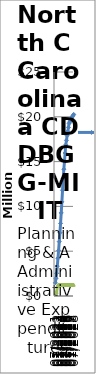
| Category | Projected Expenditures | Actual Expenditure |
|---|---|---|
| 07/2021 | 1469133.887 | 317236 |
| 10/2021 | 1967276.231 | 346652.92 |
| 01/2022 | 2525940.542 | 393251.51 |
| 04/2022 | 3331348.257 | 1084981.7 |
| 07/2022 | 4208625.807 | 1134493.33 |
| 10/2022 | 5085903.358 | 1265968.76 |
| 01/2023 | 6072876.974 | 1265968.76 |
| 04/2023 | 7064680.709 | 1265968.76 |
| 07/2023 | 8097336.771 | 1265968.76 |
| 10/2023 | 9272975.98 | 1265968.76 |
| 01/2024 | 10509893.681 | 1265968.76 |
| 04/2024 | 11808089.874 | 1265968.76 |
| 07/2024 | 13138060.099 | 1265968.76 |
| 10/2024 | 14148020.424 | 1265968.76 |
| 01/2025 | 15055849.929 | 1265968.76 |
| 04/2025 | 15962947.929 | 1265968.76 |
| 07/2025 | 16870045.929 | 1265968.76 |
| 10/2025 | 17372377.897 | 1265968.76 |
| 01/2026 | 17909708.292 | 1265968.76 |
| 04/2026 | 18363257.292 | 1265968.76 |
| 07/2026 | 18816806.292 | 1265968.76 |
| 10/2026 | 19270355.292 | 1265968.76 |
| 01/2027 | 19421537.292 | 1265968.76 |
| 04/2027 | 19572720.292 | 1265968.76 |
| 07/2027 | 19723902.292 | 1265968.76 |
| 10/2027 | 19860076.717 | 1265968.76 |
| 01/2028 | 19996251.143 | 1265968.76 |
| 04/2028 | 20132425.569 | 1265968.76 |
| 07/2028 | 20268599.995 | 1265968.76 |